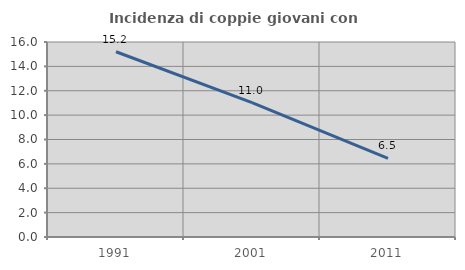
| Category | Incidenza di coppie giovani con figli |
|---|---|
| 1991.0 | 15.2 |
| 2001.0 | 11.025 |
| 2011.0 | 6.455 |